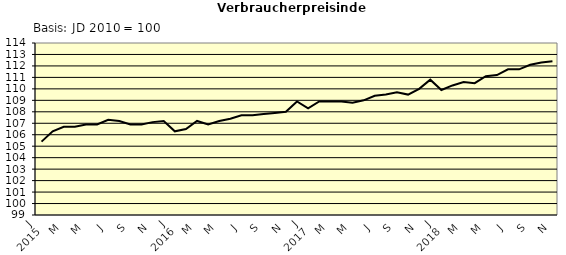
| Category | Series 0 |
|---|---|
| 0 | 105.4 |
| 1 | 106.3 |
| 2 | 106.7 |
| 3 | 106.7 |
| 4 | 106.9 |
| 5 | 106.9 |
| 6 | 107.3 |
| 7 | 107.2 |
| 8 | 106.9 |
| 9 | 106.9 |
| 10 | 107.1 |
| 11 | 107.2 |
| 12 | 106.3 |
| 13 | 106.5 |
| 14 | 107.2 |
| 15 | 106.9 |
| 16 | 107.2 |
| 17 | 107.4 |
| 18 | 107.7 |
| 19 | 107.7 |
| 20 | 107.8 |
| 21 | 107.9 |
| 22 | 108 |
| 23 | 108.9 |
| 24 | 108.3 |
| 25 | 108.9 |
| 26 | 108.9 |
| 27 | 108.9 |
| 28 | 108.8 |
| 29 | 109 |
| 30 | 109.4 |
| 31 | 109.5 |
| 32 | 109.7 |
| 33 | 109.5 |
| 34 | 110 |
| 35 | 110.8 |
| 36 | 109.9 |
| 37 | 110.3 |
| 38 | 110.6 |
| 39 | 110.5 |
| 40 | 111.1 |
| 41 | 111.2 |
| 42 | 111.7 |
| 43 | 111.7 |
| 44 | 112.1 |
| 45 | 112.3 |
| 46 | 112.4 |